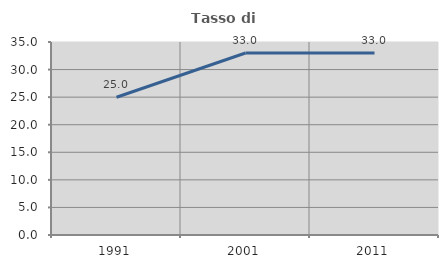
| Category | Tasso di occupazione   |
|---|---|
| 1991.0 | 24.976 |
| 2001.0 | 33.001 |
| 2011.0 | 33.022 |